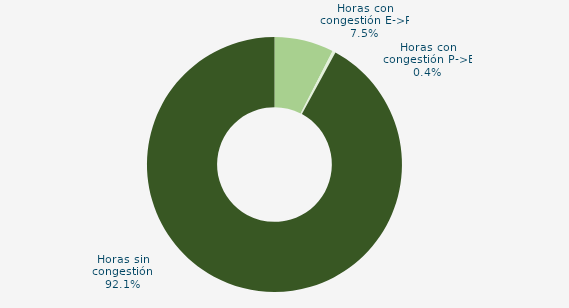
| Category | Horas con congestión E->P |
|---|---|
| Horas con congestión E->P | 7.527 |
| Horas con congestión P->E | 0.403 |
| Horas sin congestión | 92.07 |